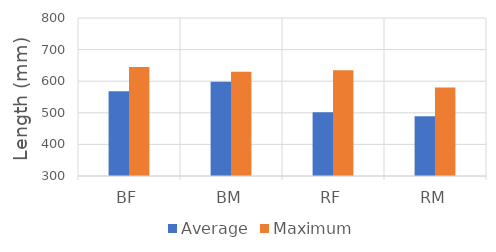
| Category | Average | Maximum |
|---|---|---|
| BF | 568 | 645 |
| BM | 598 | 630 |
| RF | 502 | 635 |
| RM | 489 | 580 |